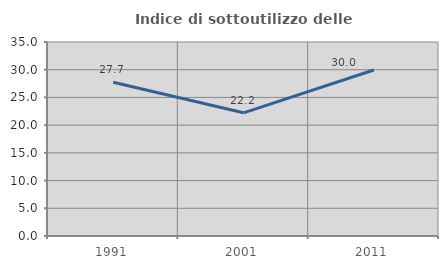
| Category | Indice di sottoutilizzo delle abitazioni  |
|---|---|
| 1991.0 | 27.73 |
| 2001.0 | 22.222 |
| 2011.0 | 29.956 |